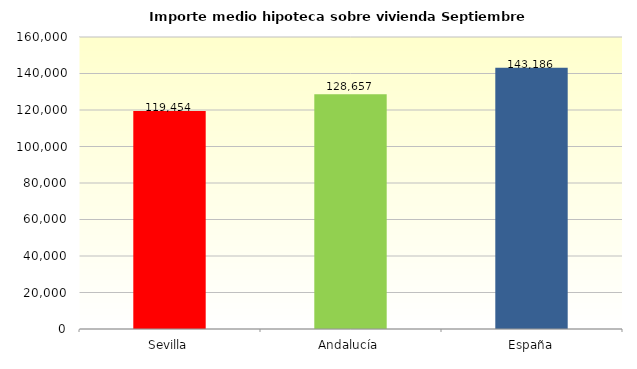
| Category | Series 2 |
|---|---|
| Sevilla | 119453.818 |
| Andalucía | 128657.119 |
| España | 143186.127 |